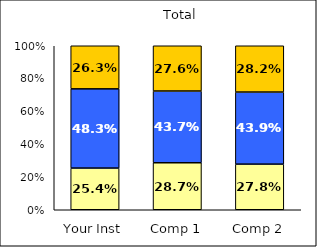
| Category | Low Pluralistic Orientation | Average Pluralistic Orientation | High Pluralistic Orientation |
|---|---|---|---|
| Your Inst | 0.254 | 0.483 | 0.263 |
| Comp 1 | 0.287 | 0.437 | 0.276 |
| Comp 2 | 0.278 | 0.439 | 0.282 |